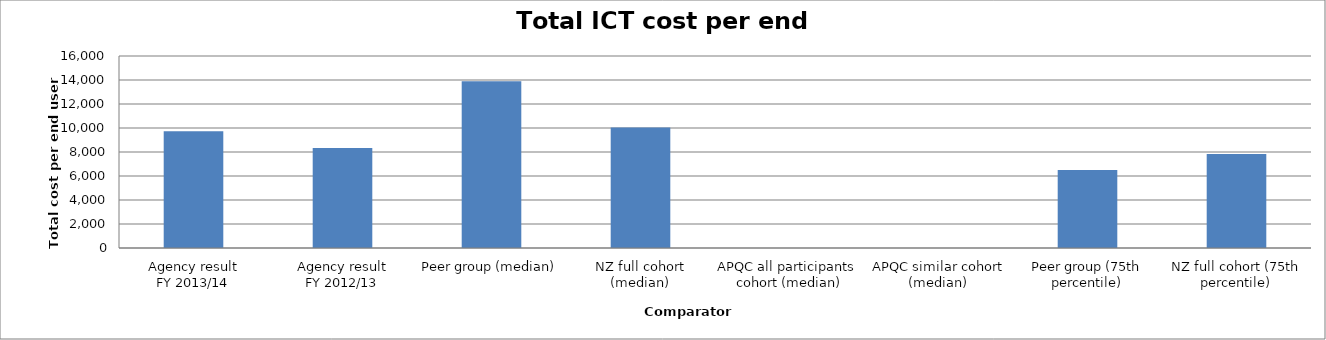
| Category | Result |
|---|---|
| Agency result
FY 2013/14 | 9729.089 |
| Agency result
FY 2012/13 | 8327.911 |
| Peer group (median) | 13886.078 |
| NZ full cohort (median) | 10045.344 |
| APQC all participants 
cohort (median) | 0 |
| APQC similar cohort (median) | 0 |
| Peer group (75th percentile) | 6507.359 |
| NZ full cohort (75th percentile) | 7839.977 |